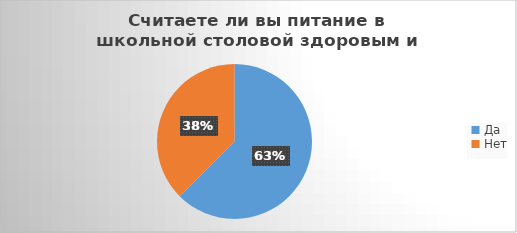
| Category | Series 0 |
|---|---|
| Да | 60 |
| Нет | 36 |